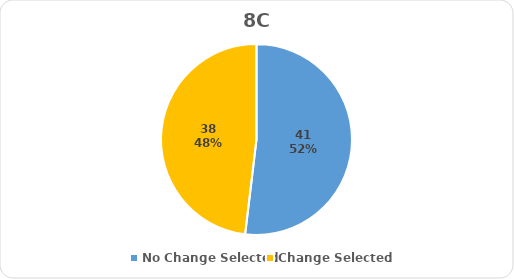
| Category | Series 0 |
|---|---|
| No Change Selected | 41 |
| Change Selected | 38 |